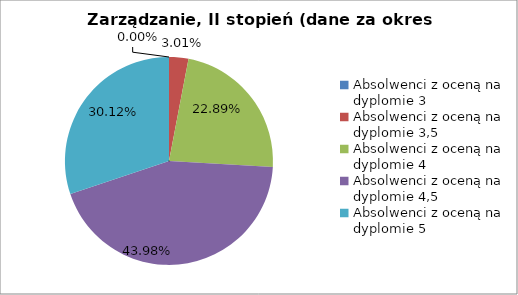
| Category | Series 0 |
|---|---|
| Absolwenci z oceną na dyplomie 3 | 0 |
| Absolwenci z oceną na dyplomie 3,5 | 3.012 |
| Absolwenci z oceną na dyplomie 4 | 22.892 |
| Absolwenci z oceną na dyplomie 4,5 | 43.976 |
| Absolwenci z oceną na dyplomie 5 | 30.12 |